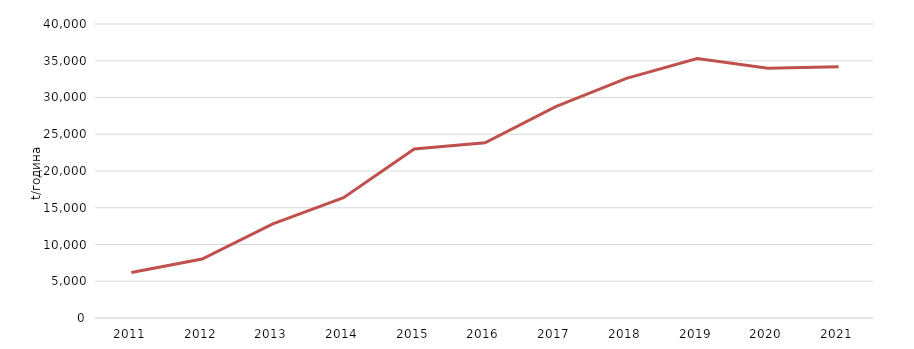
| Category | Собрана количина |
|---|---|
| 2011.0 | 6198.87 |
| 2012.0 | 8018.25 |
| 2013.0 | 12799.62 |
| 2014.0 | 16366.2 |
| 2015.0 | 22992.25 |
| 2016.0 | 23834.968 |
| 2017.0 | 28760 |
| 2018.0 | 32595.4 |
| 2019.0 | 35302.07 |
| 2020.0 | 33964.62 |
| 2021.0 | 34175.44 |